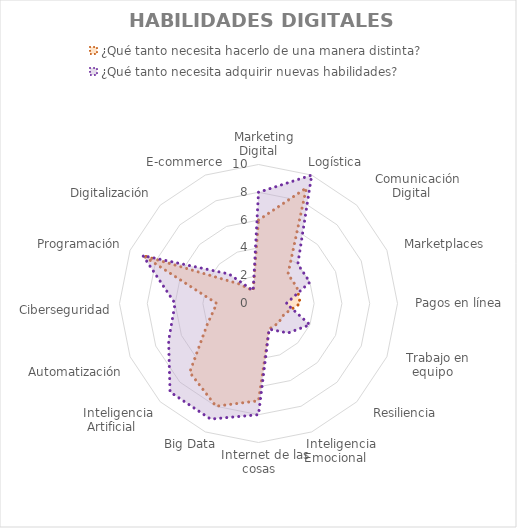
| Category | ¿Qué tanto necesita hacerlo de una manera distinta? | ¿Qué tanto necesita adquirir nuevas habilidades? |
|---|---|---|
|    Marketing Digital | 6 | 8 |
|    Logística | 9 | 10 |
|    Comunicación Digital | 3 | 4 |
|    Marketplaces | 3 | 4 |
|    Pagos en línea | 3 | 2 |
|    Trabajo en equipo | 2 | 4 |
|    Resiliencia | 2 | 3 |
|    Inteligencia Emocional | 2 | 2 |
|    Internet de las cosas | 7 | 8 |
|    Big Data | 8 | 9 |
|    Inteligencia Artificial | 7 | 9 |
|    Automatización | 4 | 7 |
|    Ciberseguridad | 3 | 6 |
|    Programación | 9 | 9 |
|    Digitalización | 2 | 3 |
|    E-commerce | 1 | 1 |